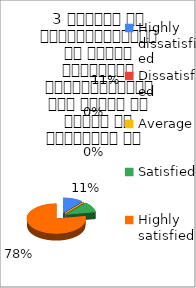
| Category | 3 शिक्षक का विद्यार्थियों के प्रति व्यव्हार मित्रतापूर्ण एवं सहयोग के भावना से परिपूर्ण था   |
|---|---|
| Highly dissatisfied | 1 |
| Dissatisfied | 0 |
| Average | 0 |
| Satisfied | 1 |
| Highly satisfied | 7 |